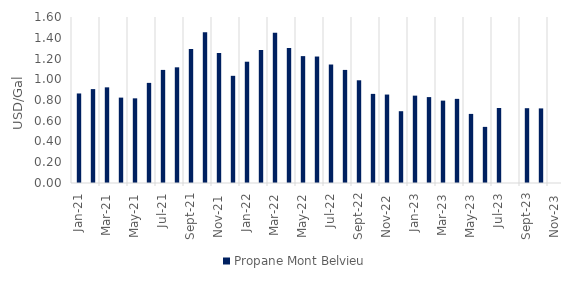
| Category | Propane Mont Belvieu |
|---|---|
| 2021-01-01 | 0.863 |
| 2021-02-01 | 0.905 |
| 2021-03-01 | 0.922 |
| 2021-04-01 | 0.823 |
| 2021-05-01 | 0.816 |
| 2021-06-01 | 0.965 |
| 2021-07-01 | 1.09 |
| 2021-08-01 | 1.115 |
| 2021-09-01 | 1.291 |
| 2021-10-01 | 1.454 |
| 2021-11-01 | 1.252 |
| 2021-12-01 | 1.033 |
| 2022-01-01 | 1.169 |
| 2022-02-01 | 1.283 |
| 2022-03-01 | 1.448 |
| 2022-04-01 | 1.302 |
| 2022-05-01 | 1.223 |
| 2022-06-01 | 1.219 |
| 2022-07-01 | 1.142 |
| 2022-08-01 | 1.09 |
| 2022-09-01 | 0.99 |
| 2022-10-01 | 0.859 |
| 2022-11-01 | 0.852 |
| 2022-12-01 | 0.692 |
| 2023-01-01 | 0.842 |
| 2023-02-01 | 0.828 |
| 2023-03-01 | 0.794 |
| 2023-04-01 | 0.811 |
| 2023-05-01 | 0.666 |
| 2023-06-01 | 0.541 |
| 2023-07-01 | 0.723 |
| 2023-08-01 | 0 |
| 2023-09-01 | 0.721 |
| 2023-10-01 | 0.719 |
| 2023-11-01 | 0 |